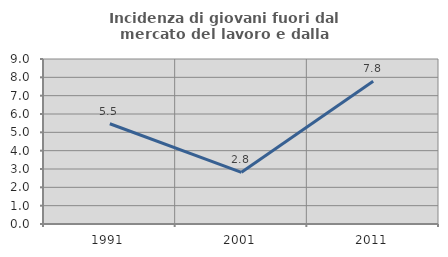
| Category | Incidenza di giovani fuori dal mercato del lavoro e dalla formazione  |
|---|---|
| 1991.0 | 5.469 |
| 2001.0 | 2.817 |
| 2011.0 | 7.792 |